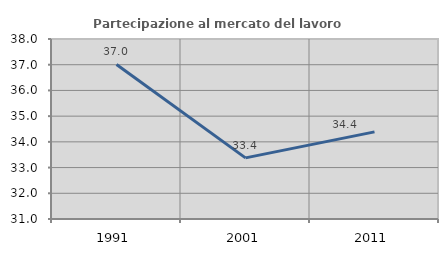
| Category | Partecipazione al mercato del lavoro  femminile |
|---|---|
| 1991.0 | 37.012 |
| 2001.0 | 33.377 |
| 2011.0 | 34.388 |